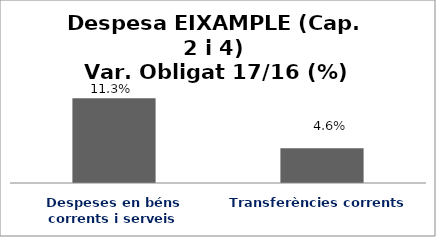
| Category | Series 0 |
|---|---|
| Despeses en béns corrents i serveis | 0.113 |
| Transferències corrents | 0.046 |